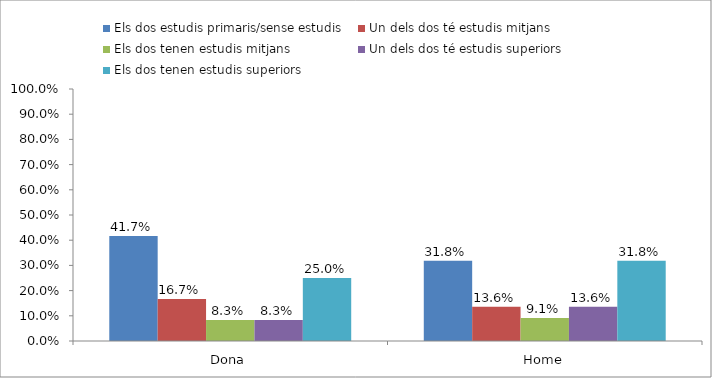
| Category | Els dos estudis primaris/sense estudis | Un dels dos té estudis mitjans | Els dos tenen estudis mitjans | Un dels dos té estudis superiors | Els dos tenen estudis superiors |
|---|---|---|---|---|---|
| Dona | 0.417 | 0.167 | 0.083 | 0.083 | 0.25 |
| Home | 0.318 | 0.136 | 0.091 | 0.136 | 0.318 |